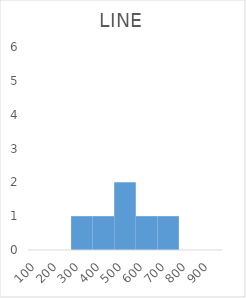
| Category | Series 0 |
|---|---|
| 100.0 | 0 |
| 200.0 | 0 |
| 300.0 | 1 |
| 400.0 | 1 |
| 500.0 | 2 |
| 600.0 | 1 |
| 700.0 | 1 |
| 800.0 | 0 |
| 900.0 | 0 |